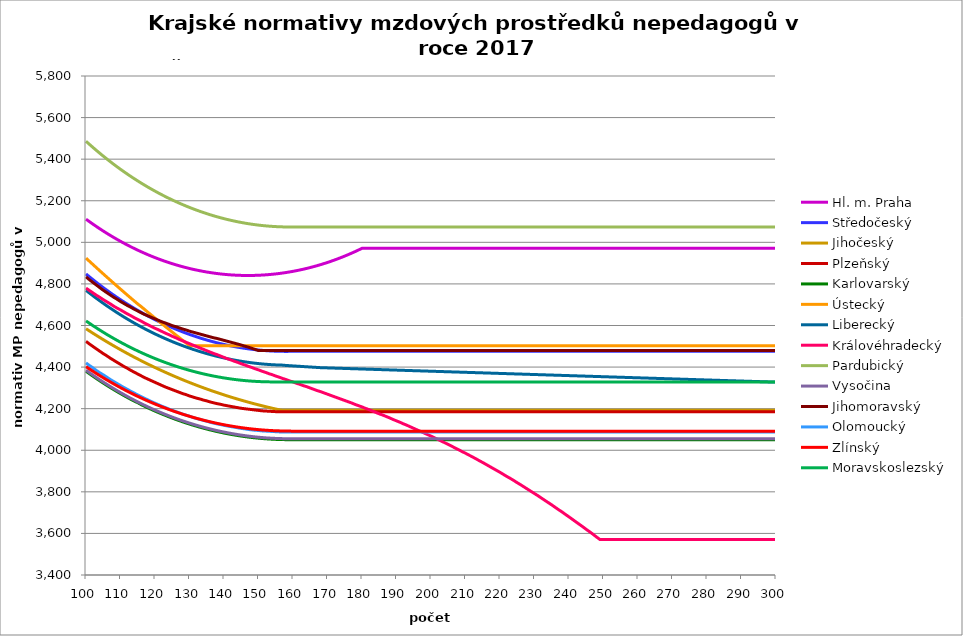
| Category | Hl. m. Praha | Středočeský | Jihočeský | Plzeňský | Karlovarský  | Ústecký   | Liberecký | Královéhradecký | Pardubický | Vysočina | Jihomoravský | Olomoucký | Zlínský | Moravskoslezský |
|---|---|---|---|---|---|---|---|---|---|---|---|---|---|---|
| 100.0 | 5111.425 | 4847.907 | 4584.483 | 4523.77 | 4380.016 | 4924.161 | 4769.078 | 4779.835 | 5486.146 | 4384.986 | 4833.959 | 4420.093 | 4402.025 | 4621.964 |
| 101.0 | 5099.399 | 4834.155 | 4573.667 | 4510.922 | 4368.097 | 4908.813 | 4756.034 | 4768.387 | 5471.218 | 4373.099 | 4819.937 | 4407.603 | 4390.87 | 4610.568 |
| 102.0 | 5087.687 | 4820.718 | 4563.018 | 4499.305 | 4356.446 | 4893.559 | 4743.282 | 4756.995 | 5456.624 | 4361.389 | 4807.259 | 4396.311 | 4379.961 | 4599.438 |
| 103.0 | 5076.284 | 4807.592 | 4552.535 | 4487.747 | 4345.057 | 4878.4 | 4730.818 | 4745.657 | 5442.359 | 4349.965 | 4794.648 | 4383.955 | 4369.294 | 4588.571 |
| 104.0 | 5065.188 | 4794.771 | 4542.216 | 4476.249 | 4333.928 | 4863.335 | 4718.638 | 4735.624 | 5428.419 | 4338.823 | 4782.104 | 4372.783 | 4358.867 | 4577.963 |
| 105.0 | 5054.393 | 4782.252 | 4532.058 | 4464.81 | 4323.054 | 4848.363 | 4706.738 | 4724.387 | 5414.799 | 4327.959 | 4769.624 | 4362.777 | 4348.675 | 4567.612 |
| 106.0 | 5043.897 | 4770.03 | 4522.06 | 4454.564 | 4312.432 | 4833.482 | 4695.114 | 4714.444 | 5401.495 | 4317.37 | 4758.448 | 4351.712 | 4338.716 | 4557.514 |
| 107.0 | 5033.697 | 4758.102 | 4512.219 | 4443.235 | 4302.059 | 4818.693 | 4683.763 | 4704.542 | 5388.503 | 4306.941 | 4747.325 | 4340.703 | 4328.988 | 4547.666 |
| 108.0 | 5023.788 | 4746.463 | 4502.535 | 4433.088 | 4291.933 | 4803.993 | 4672.682 | 4693.452 | 5375.819 | 4296.781 | 4736.253 | 4330.843 | 4319.487 | 4538.065 |
| 109.0 | 5014.168 | 4735.109 | 4493.005 | 4422.987 | 4282.048 | 4789.383 | 4661.866 | 4683.638 | 5363.438 | 4286.886 | 4726.455 | 4321.027 | 4310.211 | 4528.708 |
| 110.0 | 5004.834 | 4724.038 | 4483.628 | 4412.933 | 4272.404 | 4774.862 | 4651.312 | 4675.085 | 5351.358 | 4277.252 | 4715.48 | 4311.256 | 4301.156 | 4519.593 |
| 111.0 | 4995.782 | 4713.245 | 4474.402 | 4402.923 | 4262.996 | 4760.429 | 4641.018 | 4665.348 | 5339.574 | 4267.876 | 4705.767 | 4301.529 | 4292.322 | 4510.717 |
| 112.0 | 4987.01 | 4702.726 | 4465.325 | 4394.064 | 4253.821 | 4746.082 | 4630.98 | 4655.651 | 5328.083 | 4258.648 | 4696.095 | 4292.92 | 4283.704 | 4502.077 |
| 113.0 | 4978.514 | 4692.48 | 4456.397 | 4384.141 | 4244.878 | 4731.822 | 4621.195 | 4647.199 | 5316.881 | 4249.674 | 4687.664 | 4283.275 | 4275.301 | 4493.67 |
| 114.0 | 4970.293 | 4682.501 | 4447.614 | 4375.357 | 4236.164 | 4717.647 | 4611.66 | 4637.578 | 5305.966 | 4240.949 | 4678.065 | 4274.738 | 4267.11 | 4485.495 |
| 115.0 | 4962.344 | 4672.788 | 4438.976 | 4366.608 | 4228.731 | 4703.557 | 4602.372 | 4629.191 | 5295.333 | 4232.472 | 4669.699 | 4266.236 | 4259.13 | 4477.549 |
| 116.0 | 4954.664 | 4663.337 | 4430.482 | 4357.895 | 4219.409 | 4690.82 | 4593.329 | 4620.835 | 5284.98 | 4224.239 | 4661.362 | 4257.767 | 4251.357 | 4469.829 |
| 117.0 | 4947.251 | 4654.145 | 4422.129 | 4349.216 | 4211.365 | 4676.89 | 4584.528 | 4611.323 | 5274.904 | 4216.144 | 4653.055 | 4249.331 | 4243.79 | 4462.334 |
| 118.0 | 4940.103 | 4645.21 | 4413.917 | 4341.65 | 4203.539 | 4663.042 | 4575.966 | 4603.031 | 5265.102 | 4208.288 | 4645.958 | 4241.978 | 4236.427 | 4455.062 |
| 119.0 | 4933.216 | 4636.528 | 4405.844 | 4334.111 | 4195.929 | 4649.275 | 4567.641 | 4594.769 | 5255.57 | 4200.67 | 4638.883 | 4233.605 | 4229.266 | 4448.009 |
| 120.0 | 4926.591 | 4628.097 | 4397.908 | 4326.597 | 4188.534 | 4635.59 | 4559.55 | 4586.537 | 5246.307 | 4193.286 | 4631.83 | 4226.305 | 4222.304 | 4441.175 |
| 121.0 | 4920.223 | 4619.914 | 4390.109 | 4319.11 | 4181.35 | 4621.985 | 4551.691 | 4579.504 | 5237.31 | 4186.136 | 4624.798 | 4219.031 | 4215.541 | 4434.557 |
| 122.0 | 4914.112 | 4611.978 | 4382.445 | 4311.649 | 4174.376 | 4608.46 | 4544.062 | 4571.327 | 5228.575 | 4179.113 | 4617.787 | 4211.782 | 4208.974 | 4428.154 |
| 123.0 | 4908.255 | 4604.285 | 4374.915 | 4304.213 | 4167.611 | 4595.013 | 4536.661 | 4563.178 | 5220.101 | 4172.32 | 4611.961 | 4205.588 | 4202.601 | 4421.964 |
| 124.0 | 4902.65 | 4596.833 | 4367.517 | 4297.86 | 4161.051 | 4581.645 | 4529.485 | 4556.217 | 5211.885 | 4165.753 | 4606.149 | 4198.385 | 4196.421 | 4415.984 |
| 125.0 | 4897.297 | 4589.62 | 4360.25 | 4291.525 | 4154.696 | 4568.354 | 4522.533 | 4548.122 | 5203.924 | 4159.411 | 4599.195 | 4192.231 | 4190.432 | 4410.214 |
| 126.0 | 4892.194 | 4582.644 | 4353.114 | 4285.21 | 4148.543 | 4555.141 | 4515.803 | 4541.206 | 5196.218 | 4153.292 | 4594.57 | 4186.094 | 4184.633 | 4404.652 |
| 127.0 | 4887.338 | 4575.903 | 4346.107 | 4278.913 | 4142.591 | 4542.003 | 4509.292 | 4533.165 | 5188.763 | 4147.292 | 4588.802 | 4179.976 | 4179.023 | 4399.297 |
| 128.0 | 4882.728 | 4569.395 | 4339.227 | 4272.634 | 4136.838 | 4528.941 | 4502.999 | 4526.295 | 5181.557 | 4141.512 | 4583.049 | 4173.875 | 4173.598 | 4394.146 |
| 129.0 | 4878.364 | 4563.118 | 4332.474 | 4267.416 | 4131.283 | 4515.954 | 4496.922 | 4519.445 | 5174.599 | 4135.951 | 4578.457 | 4168.805 | 4168.359 | 4389.199 |
| 130.0 | 4874.243 | 4557.07 | 4325.847 | 4261.171 | 4125.924 | 4503.041 | 4491.06 | 4512.616 | 5167.886 | 4130.605 | 4572.73 | 4163.747 | 4163.304 | 4384.454 |
| 131.0 | 4870.365 | 4551.249 | 4319.345 | 4255.981 | 4120.759 | 4503.041 | 4485.41 | 4505.808 | 5161.416 | 4125.475 | 4568.158 | 4157.693 | 4158.432 | 4379.909 |
| 132.0 | 4866.729 | 4545.654 | 4312.966 | 4250.803 | 4115.787 | 4503.041 | 4479.972 | 4499.021 | 5155.189 | 4120.457 | 4563.596 | 4152.662 | 4153.741 | 4375.565 |
| 133.0 | 4863.333 | 4540.283 | 4306.709 | 4246.67 | 4111.007 | 4503.041 | 4474.744 | 4492.254 | 5149.202 | 4115.652 | 4559.042 | 4148.646 | 4149.231 | 4371.419 |
| 134.0 | 4860.176 | 4535.135 | 4300.574 | 4241.515 | 4106.417 | 4503.041 | 4469.724 | 4485.507 | 5143.453 | 4111.057 | 4554.498 | 4143.637 | 4144.899 | 4367.47 |
| 135.0 | 4857.258 | 4530.208 | 4294.56 | 4237.4 | 4102.017 | 4503.041 | 4464.911 | 4478.78 | 5137.942 | 4106.672 | 4549.963 | 4139.638 | 4140.745 | 4363.718 |
| 136.0 | 4854.577 | 4525.501 | 4288.666 | 4232.267 | 4097.805 | 4503.041 | 4460.304 | 4472.074 | 5132.666 | 4102.495 | 4545.436 | 4134.651 | 4136.769 | 4360.161 |
| 137.0 | 4852.133 | 4521.011 | 4282.89 | 4228.17 | 4093.779 | 4503.041 | 4455.901 | 4465.387 | 5127.624 | 4098.425 | 4540.919 | 4130.669 | 4132.968 | 4356.799 |
| 138.0 | 4849.925 | 4516.739 | 4277.232 | 4224.081 | 4089.94 | 4503.041 | 4451.702 | 4459.831 | 5122.815 | 4094.561 | 4537.537 | 4126.696 | 4129.343 | 4353.63 |
| 139.0 | 4847.953 | 4512.683 | 4271.691 | 4221.02 | 4086.285 | 4503.041 | 4447.704 | 4453.181 | 5118.237 | 4090.903 | 4533.036 | 4123.72 | 4125.891 | 4350.654 |
| 140.0 | 4846.216 | 4508.842 | 4266.266 | 4216.944 | 4082.815 | 4503.041 | 4443.908 | 4446.551 | 5113.89 | 4087.448 | 4528.543 | 4119.76 | 4122.613 | 4347.869 |
| 141.0 | 4844.713 | 4505.214 | 4260.957 | 4213.893 | 4079.527 | 4503.041 | 4440.312 | 4439.941 | 5109.772 | 4084.195 | 4524.059 | 4116.795 | 4119.507 | 4345.276 |
| 142.0 | 4843.443 | 4501.799 | 4255.762 | 4210.846 | 4076.421 | 4503.041 | 4436.915 | 4434.447 | 5105.882 | 4081.047 | 4519.585 | 4113.834 | 4116.573 | 4342.874 |
| 143.0 | 4842.408 | 4498.596 | 4250.681 | 4207.803 | 4073.496 | 4503.041 | 4433.717 | 4427.872 | 5102.218 | 4078.099 | 4515.119 | 4110.877 | 4113.81 | 4340.661 |
| 144.0 | 4841.606 | 4495.603 | 4245.713 | 4204.765 | 4070.752 | 4503.041 | 4430.716 | 4422.409 | 5098.781 | 4075.352 | 4510.661 | 4107.924 | 4111.217 | 4338.638 |
| 145.0 | 4841.037 | 4492.82 | 4240.857 | 4201.732 | 4068.188 | 4503.041 | 4427.911 | 4415.87 | 5095.569 | 4072.804 | 4506.213 | 4104.976 | 4108.794 | 4336.803 |
| 146.0 | 4840.7 | 4490.247 | 4236.112 | 4199.712 | 4065.803 | 4503.041 | 4425.302 | 4410.436 | 5092.582 | 4070.455 | 4500.665 | 4103.013 | 4106.54 | 4335.157 |
| 147.0 | 4840.597 | 4487.882 | 4231.478 | 4197.693 | 4063.596 | 4503.041 | 4422.889 | 4403.932 | 5089.818 | 4068.207 | 4496.236 | 4100.072 | 4104.454 | 4333.699 |
| 148.0 | 4840.726 | 4485.725 | 4226.955 | 4195.677 | 4061.567 | 4503.041 | 4420.67 | 4398.527 | 5087.276 | 4066.156 | 4490.713 | 4098.113 | 4102.536 | 4332.428 |
| 149.0 | 4841.088 | 4483.775 | 4222.54 | 4193.663 | 4059.715 | 4503.041 | 4418.645 | 4392.059 | 5084.957 | 4064.303 | 4485.202 | 4096.157 | 4100.786 | 4331.344 |
| 150.0 | 4841.683 | 4482.031 | 4218.235 | 4191.651 | 4058.041 | 4503.041 | 4416.813 | 4386.683 | 5082.859 | 4062.645 | 4479.706 | 4095.179 | 4099.203 | 4330.448 |
| 151.0 | 4842.511 | 4480.494 | 4214.037 | 4189.64 | 4056.542 | 4503.041 | 4415.175 | 4380.249 | 5080.983 | 4061.184 | 4479.706 | 4093.225 | 4097.787 | 4329.738 |
| 152.0 | 4843.573 | 4479.163 | 4209.947 | 4188.636 | 4055.22 | 4503.041 | 4413.729 | 4374.902 | 5079.327 | 4059.822 | 4479.706 | 4092.249 | 4096.537 | 4329.214 |
| 153.0 | 4844.868 | 4478.037 | 4205.964 | 4187.632 | 4054.073 | 4503.041 | 4412.475 | 4368.503 | 5077.891 | 4058.654 | 4479.706 | 4091.273 | 4095.453 | 4328.877 |
| 154.0 | 4846.397 | 4477.117 | 4202.087 | 4186.628 | 4053.102 | 4503.041 | 4411.413 | 4363.185 | 5076.674 | 4057.682 | 4479.706 | 4090.298 | 4094.535 | 4328.726 |
| 155.0 | 4848.161 | 4476.401 | 4198.316 | 4185.625 | 4052.306 | 4503.041 | 4410.542 | 4356.82 | 5075.677 | 4056.905 | 4479.706 | 4089.323 | 4093.782 | 4328.307 |
| 156.0 | 4850.159 | 4475.89 | 4194.65 | 4185.625 | 4051.685 | 4503.041 | 4409.863 | 4351.53 | 5074.899 | 4056.322 | 4479.706 | 4088.349 | 4093.195 | 4328.307 |
| 157.0 | 4852.393 | 4475.583 | 4192.347 | 4184.623 | 4051.239 | 4503.041 | 4409.375 | 4345.199 | 5074.34 | 4055.836 | 4479.706 | 4088.349 | 4092.773 | 4328.307 |
| 158.0 | 4854.863 | 4475.481 | 4192.347 | 4184.623 | 4050.967 | 4503.041 | 4407.784 | 4339.937 | 5074 | 4055.545 | 4479.706 | 4087.375 | 4092.516 | 4328.307 |
| 159.0 | 4857.57 | 4475.583 | 4192.347 | 4184.623 | 4050.871 | 4503.041 | 4406.724 | 4333.64 | 5073.879 | 4055.448 | 4479.706 | 4087.375 | 4092.425 | 4328.307 |
| 160.0 | 4860.515 | 4475.583 | 4192.347 | 4184.623 | 4050.948 | 4503.041 | 4405.665 | 4328.406 | 5073.733 | 4055.351 | 4479.706 | 4087.375 | 4091.398 | 4328.307 |
| 161.0 | 4863.698 | 4475.583 | 4192.347 | 4184.623 | 4050.754 | 4503.041 | 4404.606 | 4322.142 | 5073.733 | 4055.351 | 4479.706 | 4087.375 | 4091.398 | 4328.307 |
| 162.0 | 4867.121 | 4475.583 | 4192.347 | 4184.623 | 4050.754 | 4503.041 | 4403.548 | 4316.936 | 5073.733 | 4055.351 | 4479.706 | 4087.375 | 4091.398 | 4328.307 |
| 163.0 | 4870.784 | 4475.583 | 4192.347 | 4184.623 | 4050.754 | 4503.041 | 4402.49 | 4310.705 | 5073.733 | 4055.351 | 4479.706 | 4087.375 | 4091.398 | 4328.307 |
| 164.0 | 4874.689 | 4475.583 | 4192.347 | 4184.623 | 4050.754 | 4503.041 | 4401.433 | 4305.526 | 5073.733 | 4055.351 | 4479.706 | 4087.375 | 4091.398 | 4328.307 |
| 165.0 | 4878.837 | 4475.583 | 4192.347 | 4184.623 | 4050.754 | 4503.041 | 4400.376 | 4299.328 | 5073.733 | 4055.351 | 4479.706 | 4087.375 | 4091.398 | 4328.307 |
| 166.0 | 4883.228 | 4475.583 | 4192.347 | 4184.623 | 4050.754 | 4503.041 | 4399.32 | 4293.148 | 5073.733 | 4055.351 | 4479.706 | 4087.375 | 4091.398 | 4328.307 |
| 167.0 | 4887.865 | 4475.583 | 4192.347 | 4184.623 | 4050.754 | 4503.041 | 4398.264 | 4286.986 | 5073.733 | 4055.351 | 4479.706 | 4087.375 | 4091.398 | 4328.307 |
| 168.0 | 4892.748 | 4475.583 | 4192.347 | 4184.623 | 4050.754 | 4503.041 | 4397.209 | 4281.864 | 5073.733 | 4055.351 | 4479.706 | 4087.375 | 4091.398 | 4328.307 |
| 169.0 | 4897.88 | 4475.583 | 4192.347 | 4184.623 | 4050.754 | 4503.041 | 4397.209 | 4275.734 | 5073.733 | 4055.351 | 4479.706 | 4087.375 | 4091.398 | 4328.307 |
| 170.0 | 4903.261 | 4475.583 | 4192.347 | 4184.623 | 4050.754 | 4503.041 | 4396.154 | 4269.621 | 5073.733 | 4055.351 | 4479.706 | 4087.375 | 4091.398 | 4328.307 |
| 171.0 | 4908.893 | 4475.583 | 4192.347 | 4184.623 | 4050.754 | 4503.041 | 4395.581 | 4263.526 | 5073.733 | 4055.351 | 4479.706 | 4087.375 | 4091.398 | 4328.307 |
| 172.0 | 4914.778 | 4475.583 | 4192.347 | 4184.623 | 4050.754 | 4503.041 | 4395.046 | 4257.448 | 5073.733 | 4055.351 | 4479.706 | 4087.375 | 4091.398 | 4328.307 |
| 173.0 | 4920.918 | 4475.583 | 4192.347 | 4184.623 | 4050.754 | 4503.041 | 4394.511 | 4251.388 | 5073.733 | 4055.351 | 4479.706 | 4087.375 | 4091.398 | 4328.307 |
| 174.0 | 4927.314 | 4475.583 | 4192.347 | 4184.623 | 4050.754 | 4503.041 | 4393.977 | 4245.345 | 5073.733 | 4055.351 | 4479.706 | 4087.375 | 4091.398 | 4328.307 |
| 175.0 | 4933.969 | 4475.583 | 4192.347 | 4184.623 | 4050.754 | 4503.041 | 4393.442 | 4239.319 | 5073.733 | 4055.351 | 4479.706 | 4087.375 | 4091.398 | 4328.307 |
| 176.0 | 4940.884 | 4475.583 | 4192.347 | 4184.623 | 4050.754 | 4503.041 | 4392.907 | 4233.31 | 5073.733 | 4055.351 | 4479.706 | 4087.375 | 4091.398 | 4328.307 |
| 177.0 | 4948.062 | 4475.583 | 4192.347 | 4184.623 | 4050.754 | 4503.041 | 4392.373 | 4227.318 | 5073.733 | 4055.351 | 4479.706 | 4087.375 | 4091.398 | 4328.307 |
| 178.0 | 4955.504 | 4475.583 | 4192.347 | 4184.623 | 4050.754 | 4503.041 | 4391.839 | 4220.349 | 5073.733 | 4055.351 | 4479.706 | 4087.375 | 4091.398 | 4328.307 |
| 179.0 | 4963.214 | 4475.583 | 4192.347 | 4184.623 | 4050.754 | 4503.041 | 4391.305 | 4214.393 | 5073.733 | 4055.351 | 4479.706 | 4087.375 | 4091.398 | 4328.307 |
| 180.0 | 4971.193 | 4475.583 | 4192.347 | 4184.623 | 4050.754 | 4503.041 | 4390.77 | 4208.455 | 5073.733 | 4055.351 | 4479.706 | 4087.375 | 4091.398 | 4328.307 |
| 181.0 | 4971.193 | 4475.583 | 4192.347 | 4184.623 | 4050.754 | 4503.041 | 4390.237 | 4201.547 | 5073.733 | 4055.351 | 4479.706 | 4087.375 | 4091.398 | 4328.307 |
| 182.0 | 4971.193 | 4475.583 | 4192.347 | 4184.623 | 4050.754 | 4503.041 | 4389.703 | 4195.645 | 5073.733 | 4055.351 | 4479.706 | 4087.375 | 4091.398 | 4328.307 |
| 183.0 | 4971.193 | 4475.583 | 4192.347 | 4184.623 | 4050.754 | 4503.041 | 4389.169 | 4188.78 | 5073.733 | 4055.351 | 4479.706 | 4087.375 | 4091.398 | 4328.307 |
| 184.0 | 4971.193 | 4475.583 | 4192.347 | 4184.623 | 4050.754 | 4503.041 | 4388.636 | 4181.937 | 5073.733 | 4055.351 | 4479.706 | 4087.375 | 4091.398 | 4328.307 |
| 185.0 | 4971.193 | 4475.583 | 4192.347 | 4184.623 | 4050.754 | 4503.041 | 4388.102 | 4175.116 | 5073.733 | 4055.351 | 4479.706 | 4087.375 | 4091.398 | 4328.307 |
| 186.0 | 4971.193 | 4475.583 | 4192.347 | 4184.623 | 4050.754 | 4503.041 | 4387.569 | 4169.288 | 5073.733 | 4055.351 | 4479.706 | 4087.375 | 4091.398 | 4328.307 |
| 187.0 | 4971.193 | 4475.583 | 4192.347 | 4184.623 | 4050.754 | 4503.041 | 4387.036 | 4162.509 | 5073.733 | 4055.351 | 4479.706 | 4087.375 | 4091.398 | 4328.307 |
| 188.0 | 4971.193 | 4475.583 | 4192.347 | 4184.623 | 4050.754 | 4503.041 | 4386.503 | 4155.751 | 5073.733 | 4055.351 | 4479.706 | 4087.375 | 4091.398 | 4328.307 |
| 189.0 | 4971.193 | 4475.583 | 4192.347 | 4184.623 | 4050.754 | 4503.041 | 4385.97 | 4148.056 | 5073.733 | 4055.351 | 4479.706 | 4087.375 | 4091.398 | 4328.307 |
| 190.0 | 4971.193 | 4475.583 | 4192.347 | 4184.623 | 4050.754 | 4503.041 | 4385.437 | 4141.345 | 5073.733 | 4055.351 | 4479.706 | 4087.375 | 4091.398 | 4328.307 |
| 191.0 | 4971.193 | 4475.583 | 4192.347 | 4184.623 | 4050.754 | 4503.041 | 4384.905 | 4134.656 | 5073.733 | 4055.351 | 4479.706 | 4087.375 | 4091.398 | 4328.307 |
| 192.0 | 4971.193 | 4475.583 | 4192.347 | 4184.623 | 4050.754 | 4503.041 | 4384.372 | 4127.038 | 5073.733 | 4055.351 | 4479.706 | 4087.375 | 4091.398 | 4328.307 |
| 193.0 | 4971.193 | 4475.583 | 4192.347 | 4184.623 | 4050.754 | 4503.041 | 4383.84 | 4120.395 | 5073.733 | 4055.351 | 4479.706 | 4087.375 | 4091.398 | 4328.307 |
| 194.0 | 4971.193 | 4475.583 | 4192.347 | 4184.623 | 4050.754 | 4503.041 | 4383.308 | 4112.83 | 5073.733 | 4055.351 | 4479.706 | 4087.375 | 4091.398 | 4328.307 |
| 195.0 | 4971.193 | 4475.583 | 4192.347 | 4184.623 | 4050.754 | 4503.041 | 4382.776 | 4105.292 | 5073.733 | 4055.351 | 4479.706 | 4087.375 | 4091.398 | 4328.307 |
| 196.0 | 4971.193 | 4475.583 | 4192.347 | 4184.623 | 4050.754 | 4503.041 | 4382.244 | 4097.782 | 5073.733 | 4055.351 | 4479.706 | 4087.375 | 4091.398 | 4328.307 |
| 197.0 | 4971.193 | 4475.583 | 4192.347 | 4184.623 | 4050.754 | 4503.041 | 4381.712 | 4090.299 | 5073.733 | 4055.351 | 4479.706 | 4087.375 | 4091.398 | 4328.307 |
| 198.0 | 4971.193 | 4475.583 | 4192.347 | 4184.623 | 4050.754 | 4503.041 | 4381.18 | 4082.843 | 5073.733 | 4055.351 | 4479.706 | 4087.375 | 4091.398 | 4328.307 |
| 199.0 | 4971.193 | 4475.583 | 4192.347 | 4184.623 | 4050.754 | 4503.041 | 4380.649 | 4075.415 | 5073.733 | 4055.351 | 4479.706 | 4087.375 | 4091.398 | 4328.307 |
| 200.0 | 4971.193 | 4475.583 | 4192.347 | 4184.623 | 4050.754 | 4503.041 | 4380.117 | 4068.014 | 5073.733 | 4055.351 | 4479.706 | 4087.375 | 4091.398 | 4328.307 |
| 201.0 | 4971.193 | 4475.583 | 4192.347 | 4184.623 | 4050.754 | 4503.041 | 4379.586 | 4059.719 | 5073.733 | 4055.351 | 4479.706 | 4087.375 | 4091.398 | 4328.307 |
| 202.0 | 4971.193 | 4475.583 | 4192.347 | 4184.623 | 4050.754 | 4503.041 | 4379.055 | 4052.374 | 5073.733 | 4055.351 | 4479.706 | 4087.375 | 4091.398 | 4328.307 |
| 203.0 | 4971.193 | 4475.583 | 4192.347 | 4184.623 | 4050.754 | 4503.041 | 4378.524 | 4044.144 | 5073.733 | 4055.351 | 4479.706 | 4087.375 | 4091.398 | 4328.307 |
| 204.0 | 4971.193 | 4475.583 | 4192.347 | 4184.623 | 4050.754 | 4503.041 | 4377.993 | 4035.946 | 5073.733 | 4055.351 | 4479.706 | 4087.375 | 4091.398 | 4328.307 |
| 205.0 | 4971.193 | 4475.583 | 4192.347 | 4184.623 | 4050.754 | 4503.041 | 4377.462 | 4027.782 | 5073.733 | 4055.351 | 4479.706 | 4087.375 | 4091.398 | 4328.307 |
| 206.0 | 4971.193 | 4475.583 | 4192.347 | 4184.623 | 4050.754 | 4503.041 | 4376.931 | 4019.65 | 5073.733 | 4055.351 | 4479.706 | 4087.375 | 4091.398 | 4328.307 |
| 207.0 | 4971.193 | 4475.583 | 4192.347 | 4184.623 | 4050.754 | 4503.041 | 4376.401 | 4010.654 | 5073.733 | 4055.351 | 4479.706 | 4087.375 | 4091.398 | 4328.307 |
| 208.0 | 4971.193 | 4475.583 | 4192.347 | 4184.623 | 4050.754 | 4503.041 | 4375.87 | 4002.591 | 5073.733 | 4055.351 | 4479.706 | 4087.375 | 4091.398 | 4328.307 |
| 209.0 | 4971.193 | 4475.583 | 4192.347 | 4184.623 | 4050.754 | 4503.041 | 4375.34 | 3993.671 | 5073.733 | 4055.351 | 4479.706 | 4087.375 | 4091.398 | 4328.307 |
| 210.0 | 4971.193 | 4475.583 | 4192.347 | 4184.623 | 4050.754 | 4503.041 | 4374.81 | 3985.676 | 5073.733 | 4055.351 | 4479.706 | 4087.375 | 4091.398 | 4328.307 |
| 211.0 | 4971.193 | 4475.583 | 4192.347 | 4184.623 | 4050.754 | 4503.041 | 4374.28 | 3976.831 | 5073.733 | 4055.351 | 4479.706 | 4087.375 | 4091.398 | 4328.307 |
| 212.0 | 4971.193 | 4475.583 | 4192.347 | 4184.623 | 4050.754 | 4503.041 | 4373.75 | 3968.025 | 5073.733 | 4055.351 | 4479.706 | 4087.375 | 4091.398 | 4328.307 |
| 213.0 | 4971.193 | 4475.583 | 4192.347 | 4184.623 | 4050.754 | 4503.041 | 4373.22 | 3959.258 | 5073.733 | 4055.351 | 4479.706 | 4087.375 | 4091.398 | 4328.307 |
| 214.0 | 4971.193 | 4475.583 | 4192.347 | 4184.623 | 4050.754 | 4503.041 | 4372.691 | 3949.658 | 5073.733 | 4055.351 | 4479.706 | 4087.375 | 4091.398 | 4328.307 |
| 215.0 | 4971.193 | 4475.583 | 4192.347 | 4184.623 | 4050.754 | 4503.041 | 4372.161 | 3940.972 | 5073.733 | 4055.351 | 4479.706 | 4087.375 | 4091.398 | 4328.307 |
| 216.0 | 4971.193 | 4475.583 | 4192.347 | 4184.623 | 4050.754 | 4503.041 | 4371.632 | 3931.461 | 5073.733 | 4055.351 | 4479.706 | 4087.375 | 4091.398 | 4328.307 |
| 217.0 | 4971.193 | 4475.583 | 4192.347 | 4184.623 | 4050.754 | 4503.041 | 4371.102 | 3921.996 | 5073.733 | 4055.351 | 4479.706 | 4087.375 | 4091.398 | 4328.307 |
| 218.0 | 4971.193 | 4475.583 | 4192.347 | 4184.623 | 4050.754 | 4503.041 | 4370.573 | 3912.576 | 5073.733 | 4055.351 | 4479.706 | 4087.375 | 4091.398 | 4328.307 |
| 219.0 | 4971.193 | 4475.583 | 4192.347 | 4184.623 | 4050.754 | 4503.041 | 4370.044 | 3903.202 | 5073.733 | 4055.351 | 4479.706 | 4087.375 | 4091.398 | 4328.307 |
| 220.0 | 4971.193 | 4475.583 | 4192.347 | 4184.623 | 4050.754 | 4503.041 | 4369.515 | 3893.872 | 5073.733 | 4055.351 | 4479.706 | 4087.375 | 4091.398 | 4328.307 |
| 221.0 | 4971.193 | 4475.583 | 4192.347 | 4184.623 | 4050.754 | 4503.041 | 4368.987 | 3883.745 | 5073.733 | 4055.351 | 4479.706 | 4087.375 | 4091.398 | 4328.307 |
| 222.0 | 4971.193 | 4475.583 | 4192.347 | 4184.623 | 4050.754 | 4503.041 | 4368.458 | 3873.671 | 5073.733 | 4055.351 | 4479.706 | 4087.375 | 4091.398 | 4328.307 |
| 223.0 | 4971.193 | 4475.583 | 4192.347 | 4184.623 | 4050.754 | 4503.041 | 4367.93 | 3864.481 | 5073.733 | 4055.351 | 4479.706 | 4087.375 | 4091.398 | 4328.307 |
| 224.0 | 4971.193 | 4475.583 | 4192.347 | 4184.623 | 4050.754 | 4503.041 | 4367.401 | 3854.506 | 5073.733 | 4055.351 | 4479.706 | 4087.375 | 4091.398 | 4328.307 |
| 225.0 | 4971.193 | 4475.583 | 4192.347 | 4184.623 | 4050.754 | 4503.041 | 4366.873 | 3843.758 | 5073.733 | 4055.351 | 4479.706 | 4087.375 | 4091.398 | 4328.307 |
| 226.0 | 4971.193 | 4475.583 | 4192.347 | 4184.623 | 4050.754 | 4503.041 | 4366.345 | 3833.89 | 5073.733 | 4055.351 | 4479.706 | 4087.375 | 4091.398 | 4328.307 |
| 227.0 | 4971.193 | 4475.583 | 4192.347 | 4184.623 | 4050.754 | 4503.041 | 4365.817 | 3823.256 | 5073.733 | 4055.351 | 4479.706 | 4087.375 | 4091.398 | 4328.307 |
| 228.0 | 4971.193 | 4475.583 | 4192.347 | 4184.623 | 4050.754 | 4503.041 | 4365.289 | 3812.681 | 5073.733 | 4055.351 | 4479.706 | 4087.375 | 4091.398 | 4328.307 |
| 229.0 | 4971.193 | 4475.583 | 4192.347 | 4184.623 | 4050.754 | 4503.041 | 4364.761 | 3802.164 | 5073.733 | 4055.351 | 4479.706 | 4087.375 | 4091.398 | 4328.307 |
| 230.0 | 4971.193 | 4475.583 | 4192.347 | 4184.623 | 4050.754 | 4503.041 | 4364.234 | 3791.705 | 5073.733 | 4055.351 | 4479.706 | 4087.375 | 4091.398 | 4328.307 |
| 231.0 | 4971.193 | 4475.583 | 4192.347 | 4184.623 | 4050.754 | 4503.041 | 4363.706 | 3781.304 | 5073.733 | 4055.351 | 4479.706 | 4087.375 | 4091.398 | 4328.307 |
| 232.0 | 4971.193 | 4475.583 | 4192.347 | 4184.623 | 4050.754 | 4503.041 | 4363.179 | 3770.166 | 5073.733 | 4055.351 | 4479.706 | 4087.375 | 4091.398 | 4328.307 |
| 233.0 | 4971.193 | 4475.583 | 4192.347 | 4184.623 | 4050.754 | 4503.041 | 4362.652 | 3759.094 | 5073.733 | 4055.351 | 4479.706 | 4087.375 | 4091.398 | 4328.307 |
| 234.0 | 4971.193 | 4475.583 | 4192.347 | 4184.623 | 4050.754 | 4503.041 | 4362.125 | 3748.086 | 5073.733 | 4055.351 | 4479.706 | 4087.375 | 4091.398 | 4328.307 |
| 235.0 | 4971.193 | 4475.583 | 4192.347 | 4184.623 | 4050.754 | 4503.041 | 4361.598 | 3737.143 | 5073.733 | 4055.351 | 4479.706 | 4087.375 | 4091.398 | 4328.307 |
| 236.0 | 4971.193 | 4475.583 | 4192.347 | 4184.623 | 4050.754 | 4503.041 | 4361.071 | 3725.489 | 5073.733 | 4055.351 | 4479.706 | 4087.375 | 4091.398 | 4328.307 |
| 237.0 | 4971.193 | 4475.583 | 4192.347 | 4184.623 | 4050.754 | 4503.041 | 4360.544 | 3713.907 | 5073.733 | 4055.351 | 4479.706 | 4087.375 | 4091.398 | 4328.307 |
| 238.0 | 4971.193 | 4475.583 | 4192.347 | 4184.623 | 4050.754 | 4503.041 | 4360.018 | 3703.162 | 5073.733 | 4055.351 | 4479.706 | 4087.375 | 4091.398 | 4328.307 |
| 239.0 | 4971.193 | 4475.583 | 4192.347 | 4184.623 | 4050.754 | 4503.041 | 4359.491 | 3690.958 | 5073.733 | 4055.351 | 4479.706 | 4087.375 | 4091.398 | 4328.307 |
| 240.0 | 4971.193 | 4475.583 | 4192.347 | 4184.623 | 4050.754 | 4503.041 | 4358.965 | 3679.589 | 5073.733 | 4055.351 | 4479.706 | 4087.375 | 4091.398 | 4328.307 |
| 241.0 | 4971.193 | 4475.583 | 4192.347 | 4184.623 | 4050.754 | 4503.041 | 4358.439 | 3667.54 | 5073.733 | 4055.351 | 4479.706 | 4087.375 | 4091.398 | 4328.307 |
| 242.0 | 4971.193 | 4475.583 | 4192.347 | 4184.623 | 4050.754 | 4503.041 | 4357.913 | 3655.569 | 5073.733 | 4055.351 | 4479.706 | 4087.375 | 4091.398 | 4328.307 |
| 243.0 | 4971.193 | 4475.583 | 4192.347 | 4184.623 | 4050.754 | 4503.041 | 4357.387 | 3643.676 | 5073.733 | 4055.351 | 4479.706 | 4087.375 | 4091.398 | 4328.307 |
| 244.0 | 4971.193 | 4475.583 | 4192.347 | 4184.623 | 4050.754 | 4503.041 | 4356.861 | 3631.861 | 5073.733 | 4055.351 | 4479.706 | 4087.375 | 4091.398 | 4328.307 |
| 245.0 | 4971.193 | 4475.583 | 4192.347 | 4184.623 | 4050.754 | 4503.041 | 4356.335 | 3619.39 | 5073.733 | 4055.351 | 4479.706 | 4087.375 | 4091.398 | 4328.307 |
| 246.0 | 4971.193 | 4475.583 | 4192.347 | 4184.623 | 4050.754 | 4503.041 | 4355.81 | 3607.731 | 5073.733 | 4055.351 | 4479.706 | 4087.375 | 4091.398 | 4328.307 |
| 247.0 | 4971.193 | 4475.583 | 4192.347 | 4184.623 | 4050.754 | 4503.041 | 4355.284 | 3595.425 | 5073.733 | 4055.351 | 4479.706 | 4087.375 | 4091.398 | 4328.307 |
| 248.0 | 4971.193 | 4475.583 | 4192.347 | 4184.623 | 4050.754 | 4503.041 | 4354.759 | 3582.487 | 5073.733 | 4055.351 | 4479.706 | 4087.375 | 4091.398 | 4328.307 |
| 249.0 | 4971.193 | 4475.583 | 4192.347 | 4184.623 | 4050.754 | 4503.041 | 4354.234 | 3570.353 | 5073.733 | 4055.351 | 4479.706 | 4087.375 | 4091.398 | 4328.307 |
| 250.0 | 4971.193 | 4475.583 | 4192.347 | 4184.623 | 4050.754 | 4503.041 | 4353.709 | 3570.353 | 5073.733 | 4055.351 | 4479.706 | 4087.375 | 4091.398 | 4328.307 |
| 251.0 | 4971.193 | 4475.583 | 4192.347 | 4184.623 | 4050.754 | 4503.041 | 4353.184 | 3570.353 | 5073.733 | 4055.351 | 4479.706 | 4087.375 | 4091.398 | 4328.307 |
| 252.0 | 4971.193 | 4475.583 | 4192.347 | 4184.623 | 4050.754 | 4503.041 | 4352.659 | 3570.353 | 5073.733 | 4055.351 | 4479.706 | 4087.375 | 4091.398 | 4328.307 |
| 253.0 | 4971.193 | 4475.583 | 4192.347 | 4184.623 | 4050.754 | 4503.041 | 4352.134 | 3570.353 | 5073.733 | 4055.351 | 4479.706 | 4087.375 | 4091.398 | 4328.307 |
| 254.0 | 4971.193 | 4475.583 | 4192.347 | 4184.623 | 4050.754 | 4503.041 | 4351.61 | 3570.353 | 5073.733 | 4055.351 | 4479.706 | 4087.375 | 4091.398 | 4328.307 |
| 255.0 | 4971.193 | 4475.583 | 4192.347 | 4184.623 | 4050.754 | 4503.041 | 4351.085 | 3570.353 | 5073.733 | 4055.351 | 4479.706 | 4087.375 | 4091.398 | 4328.307 |
| 256.0 | 4971.193 | 4475.583 | 4192.347 | 4184.623 | 4050.754 | 4503.041 | 4350.561 | 3570.353 | 5073.733 | 4055.351 | 4479.706 | 4087.375 | 4091.398 | 4328.307 |
| 257.0 | 4971.193 | 4475.583 | 4192.347 | 4184.623 | 4050.754 | 4503.041 | 4350.037 | 3570.353 | 5073.733 | 4055.351 | 4479.706 | 4087.375 | 4091.398 | 4328.307 |
| 258.0 | 4971.193 | 4475.583 | 4192.347 | 4184.623 | 4050.754 | 4503.041 | 4349.513 | 3570.353 | 5073.733 | 4055.351 | 4479.706 | 4087.375 | 4091.398 | 4328.307 |
| 259.0 | 4971.193 | 4475.583 | 4192.347 | 4184.623 | 4050.754 | 4503.041 | 4348.989 | 3570.353 | 5073.733 | 4055.351 | 4479.706 | 4087.375 | 4091.398 | 4328.307 |
| 260.0 | 4971.193 | 4475.583 | 4192.347 | 4184.623 | 4050.754 | 4503.041 | 4348.465 | 3570.353 | 5073.733 | 4055.351 | 4479.706 | 4087.375 | 4091.398 | 4328.307 |
| 261.0 | 4971.193 | 4475.583 | 4192.347 | 4184.623 | 4050.754 | 4503.041 | 4347.941 | 3570.353 | 5073.733 | 4055.351 | 4479.706 | 4087.375 | 4091.398 | 4328.307 |
| 262.0 | 4971.193 | 4475.583 | 4192.347 | 4184.623 | 4050.754 | 4503.041 | 4347.418 | 3570.353 | 5073.733 | 4055.351 | 4479.706 | 4087.375 | 4091.398 | 4328.307 |
| 263.0 | 4971.193 | 4475.583 | 4192.347 | 4184.623 | 4050.754 | 4503.041 | 4346.894 | 3570.353 | 5073.733 | 4055.351 | 4479.706 | 4087.375 | 4091.398 | 4328.307 |
| 264.0 | 4971.193 | 4475.583 | 4192.347 | 4184.623 | 4050.754 | 4503.041 | 4346.371 | 3570.353 | 5073.733 | 4055.351 | 4479.706 | 4087.375 | 4091.398 | 4328.307 |
| 265.0 | 4971.193 | 4475.583 | 4192.347 | 4184.623 | 4050.754 | 4503.041 | 4345.848 | 3570.353 | 5073.733 | 4055.351 | 4479.706 | 4087.375 | 4091.398 | 4328.307 |
| 266.0 | 4971.193 | 4475.583 | 4192.347 | 4184.623 | 4050.754 | 4503.041 | 4345.325 | 3570.353 | 5073.733 | 4055.351 | 4479.706 | 4087.375 | 4091.398 | 4328.307 |
| 267.0 | 4971.193 | 4475.583 | 4192.347 | 4184.623 | 4050.754 | 4503.041 | 4344.802 | 3570.353 | 5073.733 | 4055.351 | 4479.706 | 4087.375 | 4091.398 | 4328.307 |
| 268.0 | 4971.193 | 4475.583 | 4192.347 | 4184.623 | 4050.754 | 4503.041 | 4344.279 | 3570.353 | 5073.733 | 4055.351 | 4479.706 | 4087.375 | 4091.398 | 4328.307 |
| 269.0 | 4971.193 | 4475.583 | 4192.347 | 4184.623 | 4050.754 | 4503.041 | 4343.757 | 3570.353 | 5073.733 | 4055.351 | 4479.706 | 4087.375 | 4091.398 | 4328.307 |
| 270.0 | 4971.193 | 4475.583 | 4192.347 | 4184.623 | 4050.754 | 4503.041 | 4343.234 | 3570.353 | 5073.733 | 4055.351 | 4479.706 | 4087.375 | 4091.398 | 4328.307 |
| 271.0 | 4971.193 | 4475.583 | 4192.347 | 4184.623 | 4050.754 | 4503.041 | 4342.712 | 3570.353 | 5073.733 | 4055.351 | 4479.706 | 4087.375 | 4091.398 | 4328.307 |
| 272.0 | 4971.193 | 4475.583 | 4192.347 | 4184.623 | 4050.754 | 4503.041 | 4342.189 | 3570.353 | 5073.733 | 4055.351 | 4479.706 | 4087.375 | 4091.398 | 4328.307 |
| 273.0 | 4971.193 | 4475.583 | 4192.347 | 4184.623 | 4050.754 | 4503.041 | 4341.667 | 3570.353 | 5073.733 | 4055.351 | 4479.706 | 4087.375 | 4091.398 | 4328.307 |
| 274.0 | 4971.193 | 4475.583 | 4192.347 | 4184.623 | 4050.754 | 4503.041 | 4341.145 | 3570.353 | 5073.733 | 4055.351 | 4479.706 | 4087.375 | 4091.398 | 4328.307 |
| 275.0 | 4971.193 | 4475.583 | 4192.347 | 4184.623 | 4050.754 | 4503.041 | 4340.623 | 3570.353 | 5073.733 | 4055.351 | 4479.706 | 4087.375 | 4091.398 | 4328.307 |
| 276.0 | 4971.193 | 4475.583 | 4192.347 | 4184.623 | 4050.754 | 4503.041 | 4340.102 | 3570.353 | 5073.733 | 4055.351 | 4479.706 | 4087.375 | 4091.398 | 4328.307 |
| 277.0 | 4971.193 | 4475.583 | 4192.347 | 4184.623 | 4050.754 | 4503.041 | 4339.58 | 3570.353 | 5073.733 | 4055.351 | 4479.706 | 4087.375 | 4091.398 | 4328.307 |
| 278.0 | 4971.193 | 4475.583 | 4192.347 | 4184.623 | 4050.754 | 4503.041 | 4339.058 | 3570.353 | 5073.733 | 4055.351 | 4479.706 | 4087.375 | 4091.398 | 4328.307 |
| 279.0 | 4971.193 | 4475.583 | 4192.347 | 4184.623 | 4050.754 | 4503.041 | 4338.537 | 3570.353 | 5073.733 | 4055.351 | 4479.706 | 4087.375 | 4091.398 | 4328.307 |
| 280.0 | 4971.193 | 4475.583 | 4192.347 | 4184.623 | 4050.754 | 4503.041 | 4338.016 | 3570.353 | 5073.733 | 4055.351 | 4479.706 | 4087.375 | 4091.398 | 4328.307 |
| 281.0 | 4971.193 | 4475.583 | 4192.347 | 4184.623 | 4050.754 | 4503.041 | 4337.495 | 3570.353 | 5073.733 | 4055.351 | 4479.706 | 4087.375 | 4091.398 | 4328.307 |
| 282.0 | 4971.193 | 4475.583 | 4192.347 | 4184.623 | 4050.754 | 4503.041 | 4336.974 | 3570.353 | 5073.733 | 4055.351 | 4479.706 | 4087.375 | 4091.398 | 4328.307 |
| 283.0 | 4971.193 | 4475.583 | 4192.347 | 4184.623 | 4050.754 | 4503.041 | 4336.453 | 3570.353 | 5073.733 | 4055.351 | 4479.706 | 4087.375 | 4091.398 | 4328.307 |
| 284.0 | 4971.193 | 4475.583 | 4192.347 | 4184.623 | 4050.754 | 4503.041 | 4335.932 | 3570.353 | 5073.733 | 4055.351 | 4479.706 | 4087.375 | 4091.398 | 4328.307 |
| 285.0 | 4971.193 | 4475.583 | 4192.347 | 4184.623 | 4050.754 | 4503.041 | 4335.411 | 3570.353 | 5073.733 | 4055.351 | 4479.706 | 4087.375 | 4091.398 | 4328.307 |
| 286.0 | 4971.193 | 4475.583 | 4192.347 | 4184.623 | 4050.754 | 4503.041 | 4334.891 | 3570.353 | 5073.733 | 4055.351 | 4479.706 | 4087.375 | 4091.398 | 4328.307 |
| 287.0 | 4971.193 | 4475.583 | 4192.347 | 4184.623 | 4050.754 | 4503.041 | 4334.37 | 3570.353 | 5073.733 | 4055.351 | 4479.706 | 4087.375 | 4091.398 | 4328.307 |
| 288.0 | 4971.193 | 4475.583 | 4192.347 | 4184.623 | 4050.754 | 4503.041 | 4333.85 | 3570.353 | 5073.733 | 4055.351 | 4479.706 | 4087.375 | 4091.398 | 4328.307 |
| 289.0 | 4971.193 | 4475.583 | 4192.347 | 4184.623 | 4050.754 | 4503.041 | 4333.33 | 3570.353 | 5073.733 | 4055.351 | 4479.706 | 4087.375 | 4091.398 | 4328.307 |
| 290.0 | 4971.193 | 4475.583 | 4192.347 | 4184.623 | 4050.754 | 4503.041 | 4332.81 | 3570.353 | 5073.733 | 4055.351 | 4479.706 | 4087.375 | 4091.398 | 4328.307 |
| 291.0 | 4971.193 | 4475.583 | 4192.347 | 4184.623 | 4050.754 | 4503.041 | 4332.29 | 3570.353 | 5073.733 | 4055.351 | 4479.706 | 4087.375 | 4091.398 | 4328.307 |
| 292.0 | 4971.193 | 4475.583 | 4192.347 | 4184.623 | 4050.754 | 4503.041 | 4331.77 | 3570.353 | 5073.733 | 4055.351 | 4479.706 | 4087.375 | 4091.398 | 4328.307 |
| 293.0 | 4971.193 | 4475.583 | 4192.347 | 4184.623 | 4050.754 | 4503.041 | 4331.251 | 3570.353 | 5073.733 | 4055.351 | 4479.706 | 4087.375 | 4091.398 | 4328.307 |
| 294.0 | 4971.193 | 4475.583 | 4192.347 | 4184.623 | 4050.754 | 4503.041 | 4330.731 | 3570.353 | 5073.733 | 4055.351 | 4479.706 | 4087.375 | 4091.398 | 4328.307 |
| 295.0 | 4971.193 | 4475.583 | 4192.347 | 4184.623 | 4050.754 | 4503.041 | 4330.212 | 3570.353 | 5073.733 | 4055.351 | 4479.706 | 4087.375 | 4091.398 | 4328.307 |
| 296.0 | 4971.193 | 4475.583 | 4192.347 | 4184.623 | 4050.754 | 4503.041 | 4329.692 | 3570.353 | 5073.733 | 4055.351 | 4479.706 | 4087.375 | 4091.398 | 4328.307 |
| 297.0 | 4971.193 | 4475.583 | 4192.347 | 4184.623 | 4050.754 | 4503.041 | 4329.173 | 3570.353 | 5073.733 | 4055.351 | 4479.706 | 4087.375 | 4091.398 | 4328.307 |
| 298.0 | 4971.193 | 4475.583 | 4192.347 | 4184.623 | 4050.754 | 4503.041 | 4328.654 | 3570.353 | 5073.733 | 4055.351 | 4479.706 | 4087.375 | 4091.398 | 4328.307 |
| 299.0 | 4971.193 | 4475.583 | 4192.347 | 4184.623 | 4050.754 | 4503.041 | 4328.135 | 3570.353 | 5073.733 | 4055.351 | 4479.706 | 4087.375 | 4091.398 | 4328.307 |
| 300.0 | 4971.193 | 4475.583 | 4192.347 | 4184.623 | 4050.754 | 4503.041 | 4327.617 | 3570.353 | 5073.733 | 4055.351 | 4479.706 | 4087.375 | 4091.398 | 4328.307 |